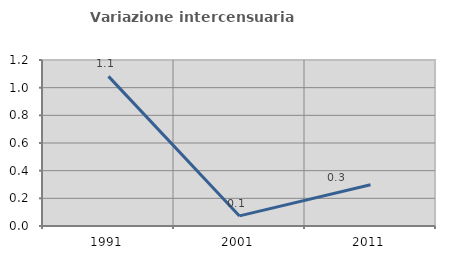
| Category | Variazione intercensuaria annua |
|---|---|
| 1991.0 | 1.082 |
| 2001.0 | 0.073 |
| 2011.0 | 0.298 |